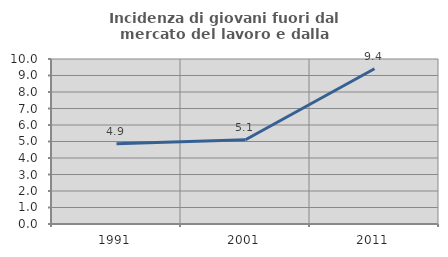
| Category | Incidenza di giovani fuori dal mercato del lavoro e dalla formazione  |
|---|---|
| 1991.0 | 4.871 |
| 2001.0 | 5.108 |
| 2011.0 | 9.407 |